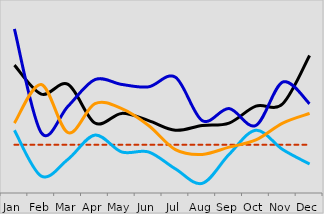
| Category | Org1 | Target / Benchmark / Std. | Org2 | Org3 | Org4 |
|---|---|---|---|---|---|
| Jan | 0.053 | 0.02 | 0.068 | 0.026 | 0.029 |
| Feb | 0.041 | 0.02 | 0.025 | 0.007 | 0.045 |
| Mar | 0.045 | 0.02 | 0.036 | 0.014 | 0.025 |
| Apr | 0.029 | 0.02 | 0.047 | 0.024 | 0.037 |
| May | 0.033 | 0.02 | 0.045 | 0.017 | 0.035 |
| Jun | 0.03 | 0.02 | 0.044 | 0.017 | 0.028 |
| Jul | 0.026 | 0.02 | 0.048 | 0.01 | 0.018 |
| Aug | 0.028 | 0.02 | 0.03 | 0.004 | 0.016 |
| Sep | 0.029 | 0.02 | 0.035 | 0.016 | 0.019 |
| Oct | 0.036 | 0.02 | 0.028 | 0.026 | 0.022 |
| Nov | 0.037 | 0.02 | 0.046 | 0.018 | 0.029 |
| Dec | 0.057 | 0.02 | 0.037 | 0.012 | 0.033 |